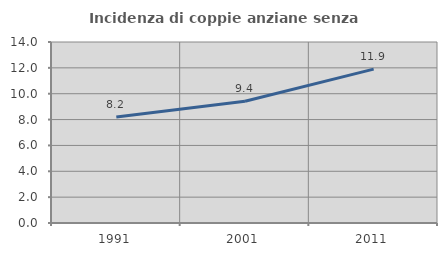
| Category | Incidenza di coppie anziane senza figli  |
|---|---|
| 1991.0 | 8.194 |
| 2001.0 | 9.422 |
| 2011.0 | 11.905 |